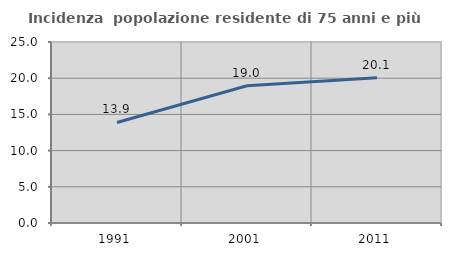
| Category | Incidenza  popolazione residente di 75 anni e più |
|---|---|
| 1991.0 | 13.885 |
| 2001.0 | 18.963 |
| 2011.0 | 20.076 |